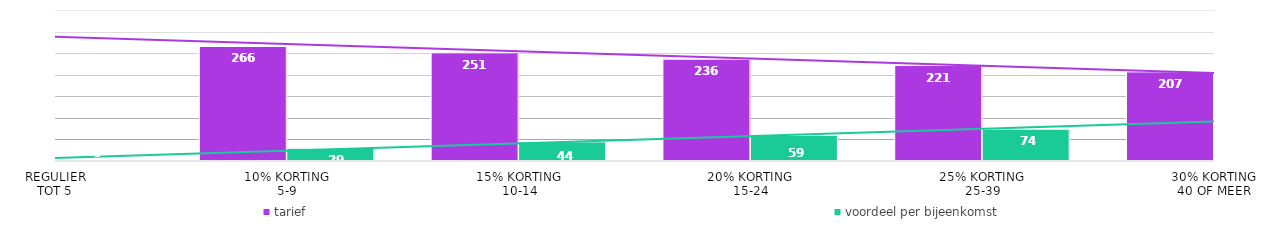
| Category | tarief | voordeel per bijeenkomst |
|---|---|---|
| 0 | 295 | 0 |
| 1 | 265.5 | 29.5 |
| 2 | 250.75 | 44.25 |
| 3 | 236 | 59 |
| 4 | 221.25 | 73.75 |
| 5 | 206.5 | 88.5 |